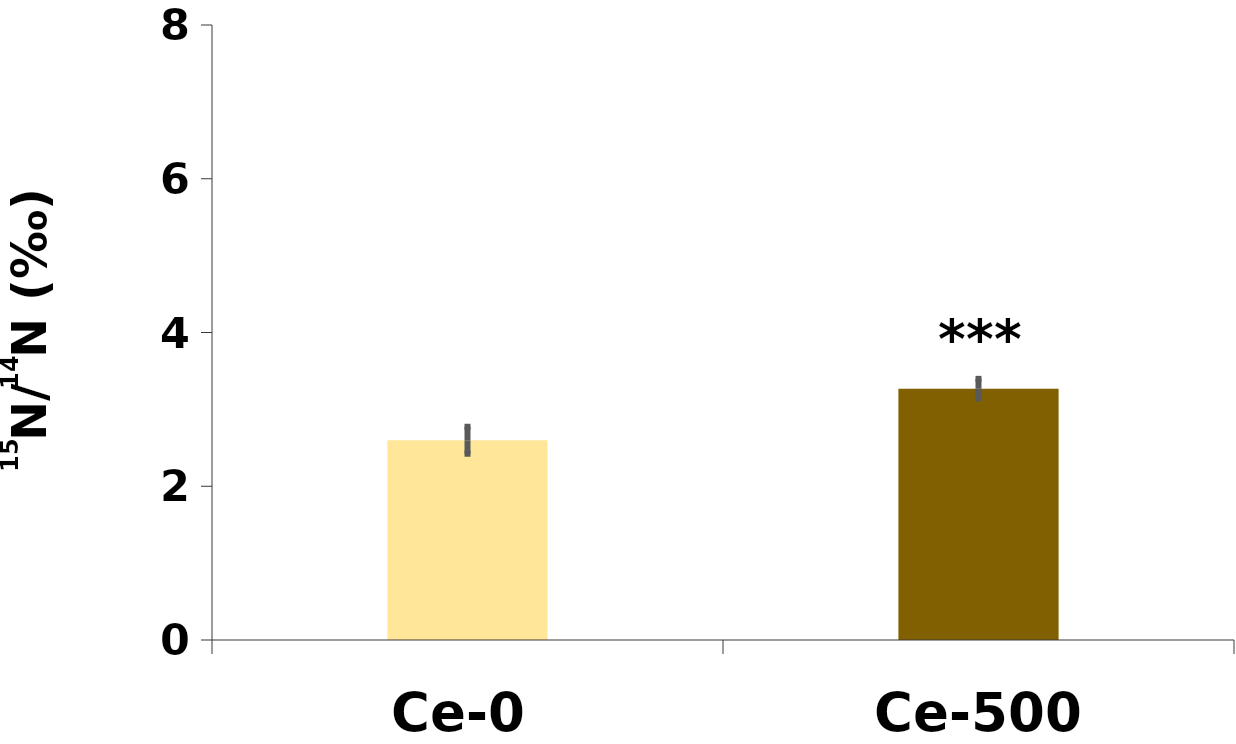
| Category | δ15N |
|---|---|
| Ce-0 | 2.598 |
| Ce-500 | 3.27 |